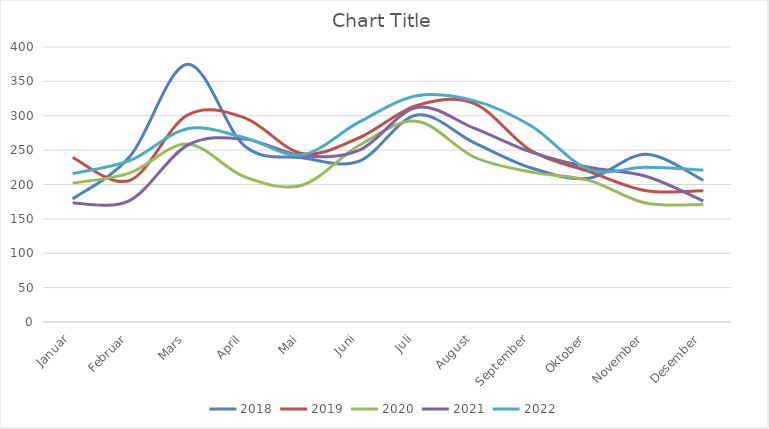
| Category | 2018 | 2019 | 2020 | 2021 | 2022 |
|---|---|---|---|---|---|
| Januar | 179 | 239 | 202 | 173 | 216 |
| Februar | 241 | 206 | 217 | 177 | 235 |
| Mars | 375 | 301 | 259 | 257 | 281 |
| April | 256 | 297 | 211 | 266 | 268 |
| Mai | 239 | 245 | 199 | 242 | 243 |
| Juni | 234 | 268 | 257 | 250 | 291 |
| Juli | 301 | 315 | 292 | 312 | 329 |
| August | 261 | 318 | 240 | 282 | 322 |
| September | 224 | 249 | 218 | 247 | 285 |
| Oktober | 209 | 219 | 206 | 225 | 222 |
| November | 244 | 191 | 173 | 212 | 225 |
| Desember | 206 | 191 | 171 | 176 | 221 |